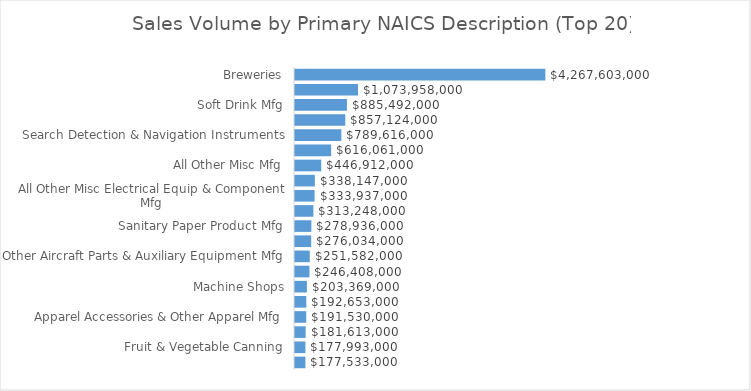
| Category | Total |
|---|---|
| Breweries | 4267603000 |
| Petroleum Refineries | 1073958000 |
| Soft Drink Mfg | 885492000 |
| Paper (Except Newsprint) Mills | 857124000 |
| Search Detection & Navigation Instruments | 789616000 |
| Other Motor Vehicle Parts Mfg | 616061000 |
| All Other Misc Mfg | 446912000 |
| All Other Plastics Product Mfg | 338147000 |
| All Other Misc Electrical Equip & Component Mfg | 333937000 |
| All Other Misc Textile Product Mills | 313248000 |
| Sanitary Paper Product Mfg | 278936000 |
| Printing Ink Mfg | 276034000 |
| Other Aircraft Parts & Auxiliary Equipment Mfg | 251582000 |
| Analytical Laboratory Instrument Mfg | 246408000 |
| Machine Shops | 203369000 |
| Wineries | 192653000 |
| Apparel Accessories & Other Apparel Mfg | 191530000 |
| Surgical & Medical Instrument Mfg | 181613000 |
| Fruit & Vegetable Canning | 177993000 |
| All Other Misc General Purpose Machinery Mfg | 177533000 |